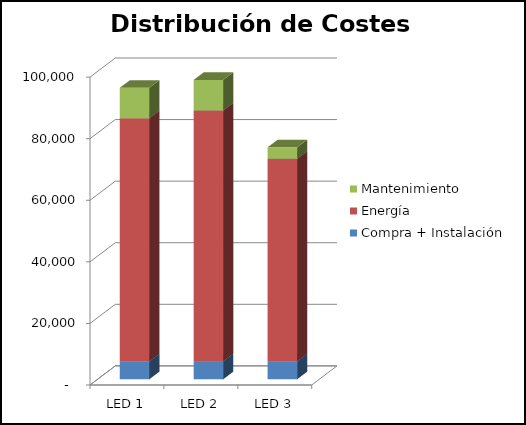
| Category | Compra + Instalación | Energía | Mantenimiento |
|---|---|---|---|
| LED 1 | 5833.333 | 78921.324 | 9897.026 |
| LED 2 | 5916.667 | 81387.615 | 9931.629 |
| LED 3 | 5833.333 | 65767.77 | 3720.555 |